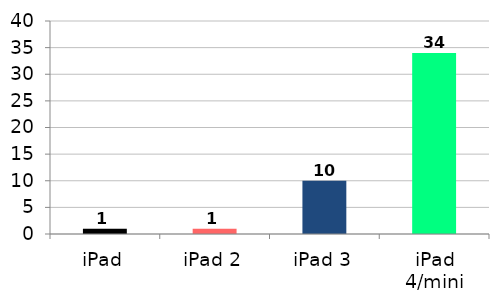
| Category | Series 0 |
|---|---|
| iPad | 1 |
| iPad 2 | 1 |
| iPad 3 | 10 |
| iPad 4/mini | 34 |